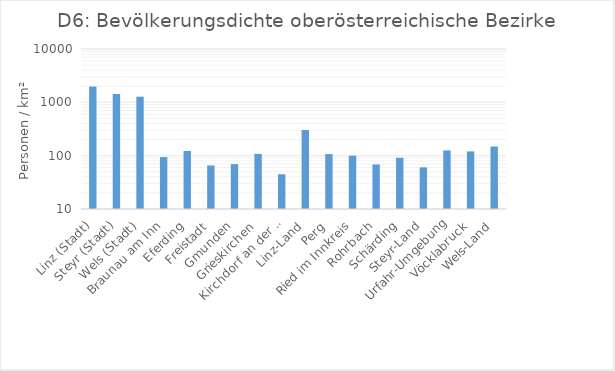
| Category | Personen / km² |
|---|---|
| Linz (Stadt) | 1978.423 |
| Steyr (Stadt) | 1438.441 |
| Wels (Stadt) | 1275.936 |
| Braunau am Inn | 94.029 |
| Eferding | 122.335 |
| Freistadt | 65.515 |
| Gmunden | 69.385 |
| Grieskirchen | 108.042 |
| Kirchdorf an der Krems | 44.812 |
| Linz-Land | 302.262 |
| Perg | 107.149 |
| Ried im Innkreis | 100.089 |
| Rohrbach | 68.468 |
| Schärding | 91.232 |
| Steyr-Land | 60.41 |
| Urfahr-Umgebung | 125.36 |
| Vöcklabruck | 120.189 |
| Wels-Land | 148.462 |